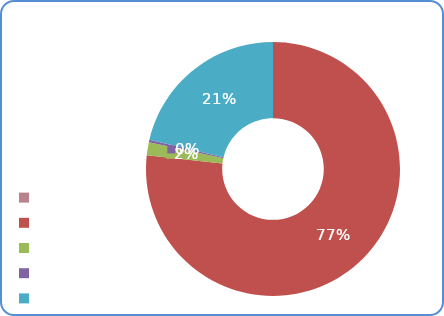
| Category | Доходы |
|---|---|
| Субсидии | 0 |
| Дотации | 81010300 |
| Налоговые доходы | 1760200 |
| Неналоговые доходы | 321100 |
| Субвенции | 22509100 |